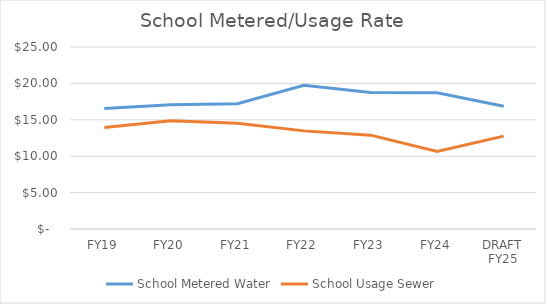
| Category | School Metered Water | School Usage Sewer |
|---|---|---|
| FY19 | 16.56 | 13.95 |
| FY20 | 17.054 | 14.859 |
| FY21 | 17.212 | 14.512 |
| FY22 | 19.739 | 13.479 |
| FY23 | 18.741 | 12.89 |
| FY24 | 18.723 | 10.656 |
| DRAFT FY25 | 16.85 | 12.76 |